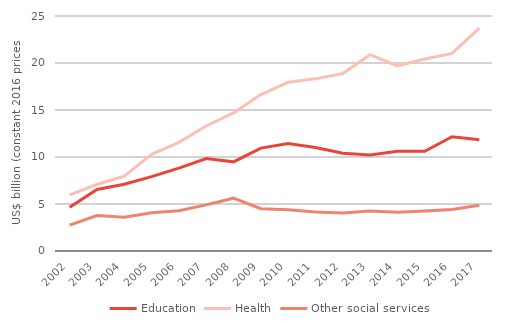
| Category | Education | Health | Other social services |
|---|---|---|---|
| 2002 | 4655.313 | 5960.271 | 2761.566 |
| 2003 | 6547.298 | 7070.268 | 3775.67 |
| 2004 | 7096.84 | 7972.168 | 3593.367 |
| 2005 | 7917.449 | 10289.928 | 4071.001 |
| 2006 | 8819.548 | 11552.335 | 4293.751 |
| 2007 | 9830.037 | 13302.524 | 4908.267 |
| 2008 | 9485.327 | 14684.058 | 5618.883 |
| 2009 | 10942.382 | 16643.938 | 4494.334 |
| 2010 | 11436.91 | 17946.207 | 4383.925 |
| 2011 | 11020.315 | 18312.636 | 4148.658 |
| 2012 | 10407.739 | 18885.64 | 4035.303 |
| 2013 | 10214.097 | 20885.681 | 4245.96 |
| 2014 | 10606.564 | 19684.57 | 4135.523 |
| 2015 | 10613.589 | 20424.494 | 4248.406 |
| 2016 | 12154.118 | 21020.166 | 4421.705 |
| 2017 | 11829.407 | 23707.673 | 4868.363 |